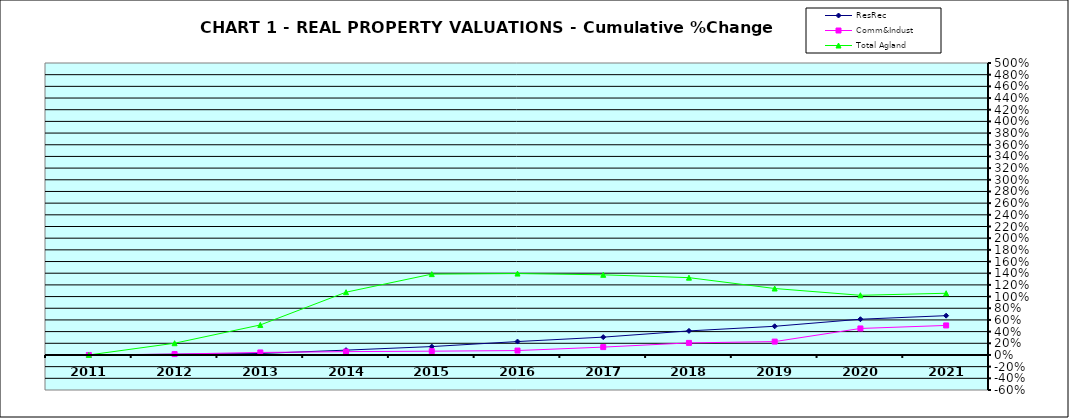
| Category | ResRec | Comm&Indust | Total Agland |
|---|---|---|---|
| 2011.0 | 0 | 0 | 0 |
| 2012.0 | 0.012 | 0.015 | 0.201 |
| 2013.0 | 0.025 | 0.043 | 0.514 |
| 2014.0 | 0.083 | 0.057 | 1.075 |
| 2015.0 | 0.144 | 0.065 | 1.384 |
| 2016.0 | 0.23 | 0.076 | 1.394 |
| 2017.0 | 0.305 | 0.135 | 1.373 |
| 2018.0 | 0.412 | 0.207 | 1.324 |
| 2019.0 | 0.491 | 0.229 | 1.138 |
| 2020.0 | 0.612 | 0.454 | 1.022 |
| 2021.0 | 0.673 | 0.506 | 1.057 |